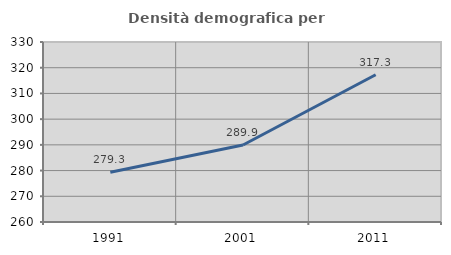
| Category | Densità demografica |
|---|---|
| 1991.0 | 279.329 |
| 2001.0 | 289.935 |
| 2011.0 | 317.257 |